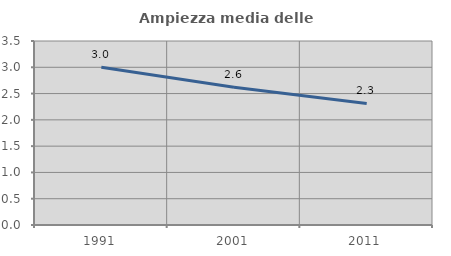
| Category | Ampiezza media delle famiglie |
|---|---|
| 1991.0 | 3.001 |
| 2001.0 | 2.619 |
| 2011.0 | 2.313 |